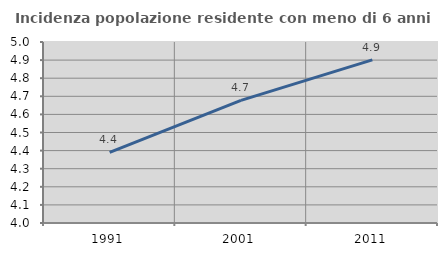
| Category | Incidenza popolazione residente con meno di 6 anni |
|---|---|
| 1991.0 | 4.39 |
| 2001.0 | 4.677 |
| 2011.0 | 4.901 |